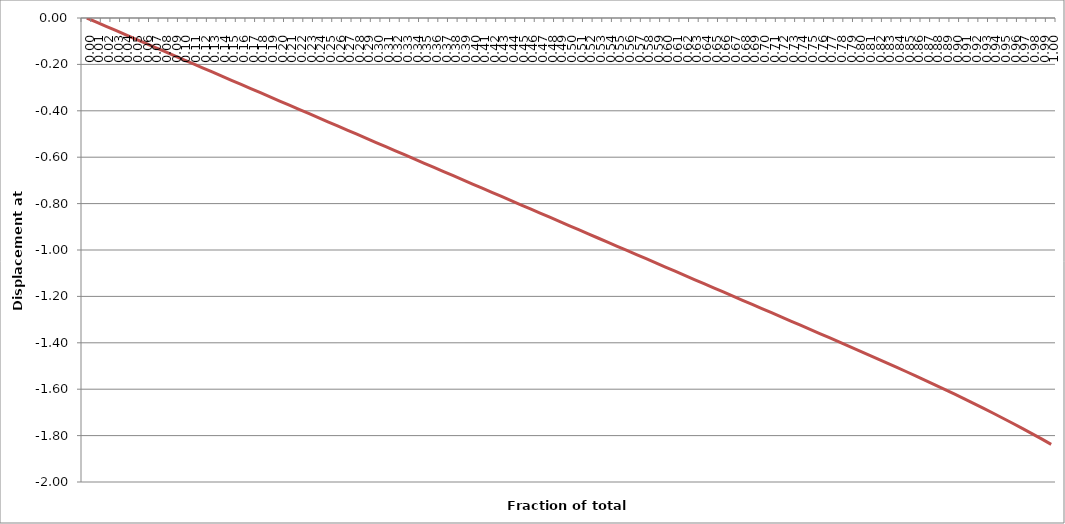
| Category | Displacement at mid-span [mm] |
|---|---|
| 0.0 | 0 |
| 0.01 | -0.018 |
| 0.02 | -0.036 |
| 0.03 | -0.054 |
| 0.04 | -0.072 |
| 0.05 | -0.089 |
| 0.06 | -0.107 |
| 0.06999999999999999 | -0.125 |
| 0.08 | -0.143 |
| 0.09 | -0.161 |
| 0.1 | -0.179 |
| 0.11000000000000001 | -0.197 |
| 0.12 | -0.215 |
| 0.13 | -0.233 |
| 0.13999999999999999 | -0.25 |
| 0.15 | -0.268 |
| 0.16 | -0.286 |
| 0.16999999999999998 | -0.304 |
| 0.18 | -0.322 |
| 0.19 | -0.34 |
| 0.2 | -0.358 |
| 0.21000000000000002 | -0.376 |
| 0.22000000000000003 | -0.394 |
| 0.22999999999999998 | -0.412 |
| 0.24 | -0.429 |
| 0.25 | -0.447 |
| 0.26 | -0.465 |
| 0.27 | -0.483 |
| 0.27999999999999997 | -0.501 |
| 0.29 | -0.519 |
| 0.3 | -0.537 |
| 0.31 | -0.555 |
| 0.32 | -0.573 |
| 0.32999999999999996 | -0.59 |
| 0.33999999999999997 | -0.608 |
| 0.35 | -0.626 |
| 0.36 | -0.644 |
| 0.37 | -0.662 |
| 0.38 | -0.68 |
| 0.39 | -0.698 |
| 0.4 | -0.716 |
| 0.41 | -0.734 |
| 0.42000000000000004 | -0.751 |
| 0.43 | -0.769 |
| 0.44000000000000006 | -0.787 |
| 0.45 | -0.805 |
| 0.45999999999999996 | -0.823 |
| 0.47000000000000003 | -0.841 |
| 0.48 | -0.859 |
| 0.49000000000000005 | -0.877 |
| 0.5 | -0.895 |
| 0.51 | -0.912 |
| 0.52 | -0.93 |
| 0.53 | -0.948 |
| 0.54 | -0.966 |
| 0.55 | -0.984 |
| 0.5599999999999999 | -1.002 |
| 0.5700000000000001 | -1.02 |
| 0.58 | -1.038 |
| 0.5900000000000001 | -1.056 |
| 0.6 | -1.074 |
| 0.61 | -1.091 |
| 0.62 | -1.109 |
| 0.63 | -1.127 |
| 0.64 | -1.145 |
| 0.65 | -1.163 |
| 0.6599999999999999 | -1.181 |
| 0.67 | -1.199 |
| 0.6799999999999999 | -1.217 |
| 0.6900000000000001 | -1.235 |
| 0.7 | -1.252 |
| 0.71 | -1.27 |
| 0.72 | -1.288 |
| 0.73 | -1.306 |
| 0.74 | -1.324 |
| 0.75 | -1.342 |
| 0.76 | -1.36 |
| 0.77 | -1.378 |
| 0.78 | -1.396 |
| 0.79 | -1.414 |
| 0.8 | -1.432 |
| 0.8099999999999999 | -1.451 |
| 0.82 | -1.469 |
| 0.8300000000000001 | -1.487 |
| 0.8400000000000001 | -1.506 |
| 0.85 | -1.525 |
| 0.86 | -1.544 |
| 0.8699999999999999 | -1.563 |
| 0.8800000000000001 | -1.582 |
| 0.89 | -1.602 |
| 0.9 | -1.622 |
| 0.9099999999999999 | -1.642 |
| 0.9199999999999999 | -1.662 |
| 0.93 | -1.683 |
| 0.9400000000000001 | -1.704 |
| 0.95 | -1.725 |
| 0.96 | -1.747 |
| 0.97 | -1.769 |
| 0.9800000000000001 | -1.791 |
| 0.99 | -1.814 |
| 1.0 | -1.838 |